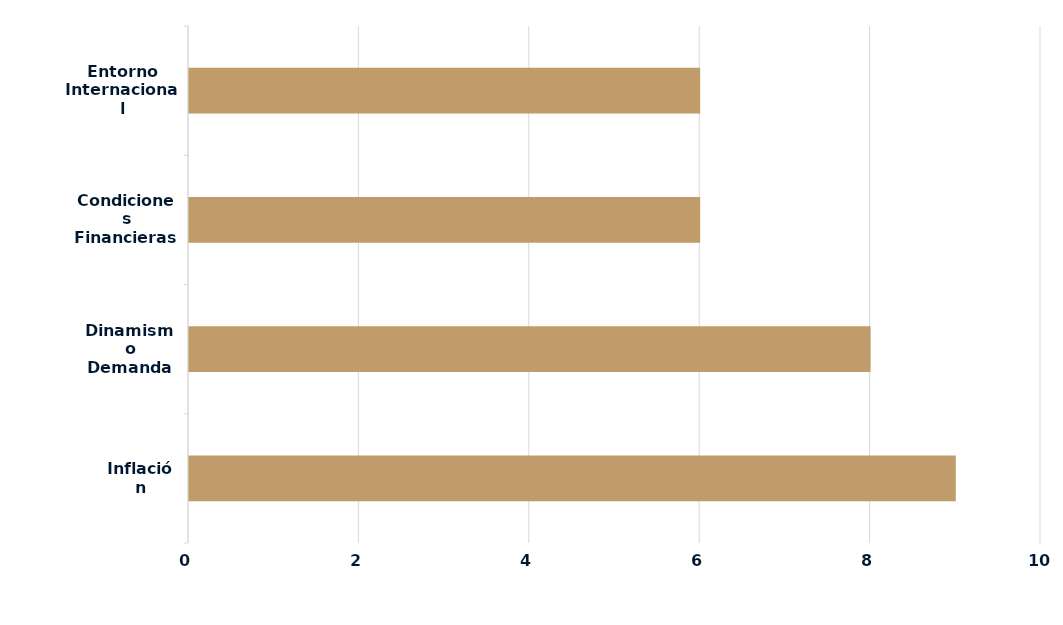
| Category | Series 0 |
|---|---|
| Inflación | 9 |
| Dinamismo Demanda | 8 |
| Condiciones Financieras Locales | 6 |
| Entorno Internacional | 6 |